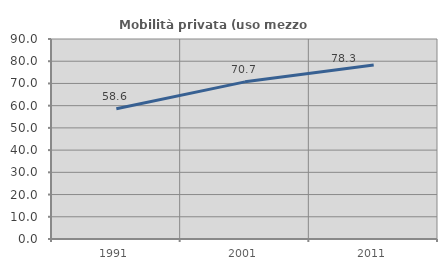
| Category | Mobilità privata (uso mezzo privato) |
|---|---|
| 1991.0 | 58.618 |
| 2001.0 | 70.713 |
| 2011.0 | 78.251 |